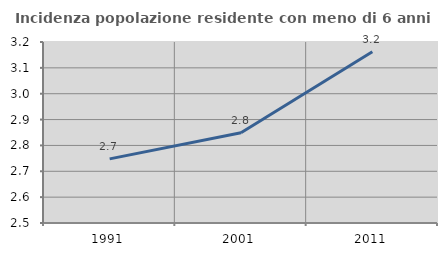
| Category | Incidenza popolazione residente con meno di 6 anni |
|---|---|
| 1991.0 | 2.748 |
| 2001.0 | 2.849 |
| 2011.0 | 3.162 |